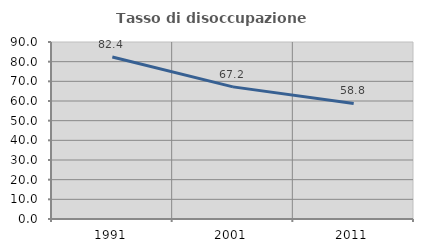
| Category | Tasso di disoccupazione giovanile  |
|---|---|
| 1991.0 | 82.394 |
| 2001.0 | 67.188 |
| 2011.0 | 58.763 |